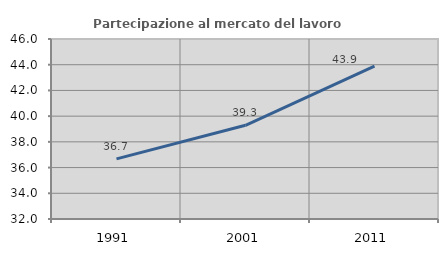
| Category | Partecipazione al mercato del lavoro  femminile |
|---|---|
| 1991.0 | 36.675 |
| 2001.0 | 39.288 |
| 2011.0 | 43.885 |